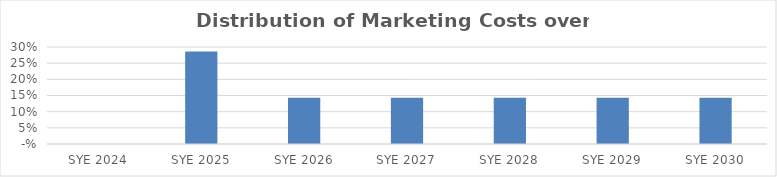
| Category | Series 0 |
|---|---|
| 2024.0 | 0 |
| 2025.0 | 0.286 |
| 2026.0 | 0.143 |
| 2027.0 | 0.143 |
| 2028.0 | 0.143 |
| 2029.0 | 0.143 |
| 2030.0 | 0.143 |